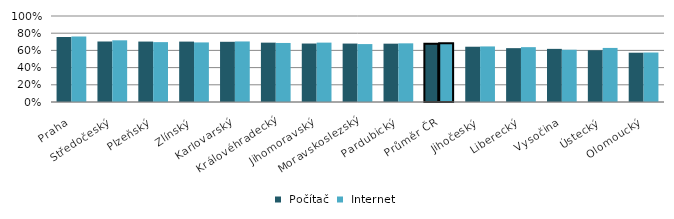
| Category |  Počítač |  Internet |
|---|---|---|
| Praha | 0.757 | 0.761 |
| Středočeský | 0.704 | 0.717 |
| Plzeňský | 0.703 | 0.696 |
| Zlínský | 0.702 | 0.693 |
| Karlovarský | 0.7 | 0.704 |
| Královéhradecký | 0.69 | 0.686 |
| Jihomoravský | 0.68 | 0.691 |
| Moravskoslezský | 0.679 | 0.674 |
| Pardubický | 0.678 | 0.682 |
| Průměr ČR | 0.678 | 0.682 |
| Jihočeský | 0.643 | 0.646 |
| Liberecký | 0.626 | 0.638 |
| Vysočina | 0.618 | 0.608 |
| Ústecký | 0.602 | 0.629 |
| Olomoucký | 0.573 | 0.575 |